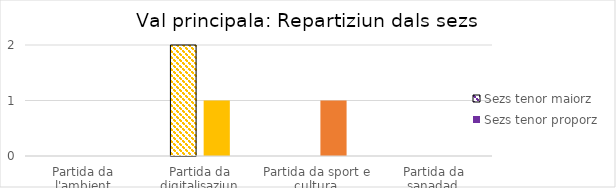
| Category | Sezs tenor maiorz | Sezs tenor proporz |
|---|---|---|
| Partida da l'ambient | 0 | 0 |
| Partida da digitalisaziun | 2 | 1 |
| Partida da sport e cultura  | 0 | 1 |
| Partida da sanadad  | 0 | 0 |